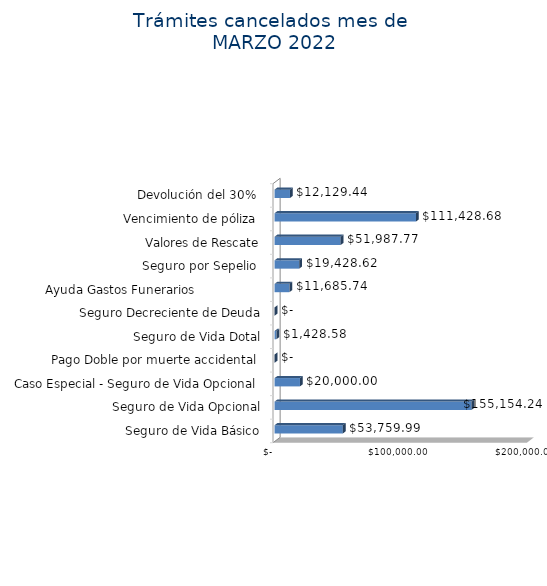
| Category | Monto  |
|---|---|
| Seguro de Vida Básico | 53759.99 |
| Seguro de Vida Opcional | 155154.24 |
| Caso Especial - Seguro de Vida Opcional  | 20000 |
| Pago Doble por muerte accidental  | 0 |
| Seguro de Vida Dotal | 1428.58 |
| Seguro Decreciente de Deuda | 0 |
| Ayuda Gastos Funerarios                  | 11685.74 |
| Seguro por Sepelio  | 19428.62 |
| Valores de Rescate | 51987.77 |
| Vencimiento de póliza  | 111428.68 |
| Devolución del 30%  | 12129.44 |